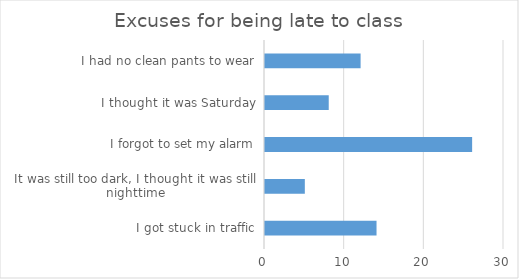
| Category | Frequency |
|---|---|
| I got stuck in traffic | 14 |
| It was still too dark, I thought it was still nighttime | 5 |
| I forgot to set my alarm | 26 |
| I thought it was Saturday | 8 |
| I had no clean pants to wear | 12 |